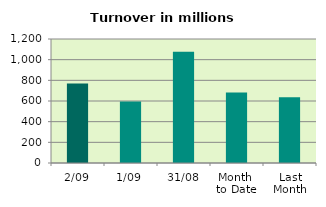
| Category | Series 0 |
|---|---|
| 2/09 | 769.582 |
| 1/09 | 595.064 |
| 31/08 | 1077.259 |
| Month 
to Date | 682.323 |
| Last
Month | 635.477 |